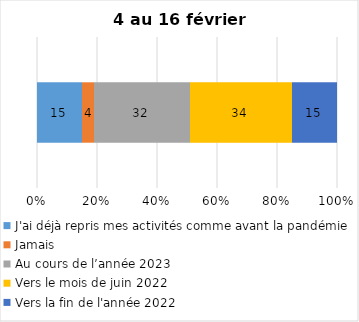
| Category | J'ai déjà repris mes activités comme avant la pandémie | Jamais | Au cours de l’année 2023 | Vers le mois de juin 2022 | Vers la fin de l'année 2022 |
|---|---|---|---|---|---|
| 0 | 15 | 4 | 32 | 34 | 15 |